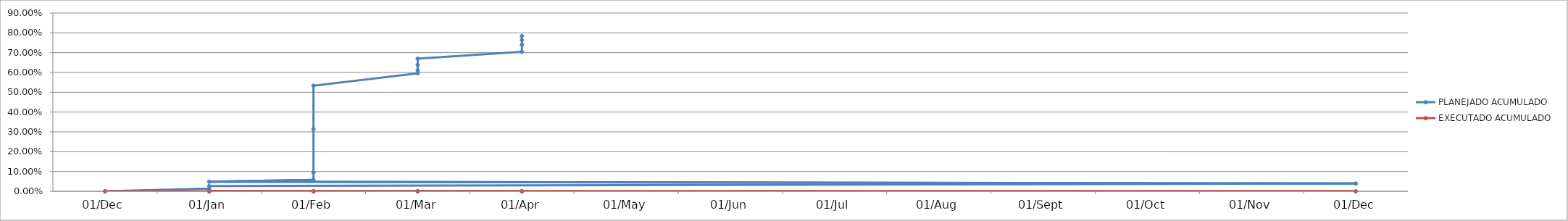
| Category | PLANEJADO ACUMULADO | EXECUTADO ACUMULADO |
|---|---|---|
| 2023-12-29 | 0 | 0 |
| 2024-01-08 | 0.014 | 0 |
| 2024-01-15 | 0.027 | 0 |
| 2024-12-21 | 0.039 | 0 |
| 2024-01-29 | 0.048 | 0 |
| 2024-02-05 | 0.057 | 0 |
| 2024-02-12 | 0.094 | 0 |
| 2024-02-19 | 0.314 | 0 |
| 2024-02-26 | 0.533 | 0 |
| 2024-03-04 | 0.596 | 0 |
| 2024-03-11 | 0.611 | 0 |
| 2024-03-18 | 0.638 | 0 |
| 2024-03-25 | 0.67 | 0 |
| 2024-04-01 | 0.704 | 0 |
| 2024-04-08 | 0.74 | 0 |
| 2024-04-15 | 0.763 | 0 |
| 2024-04-22 | 0.784 | 0 |